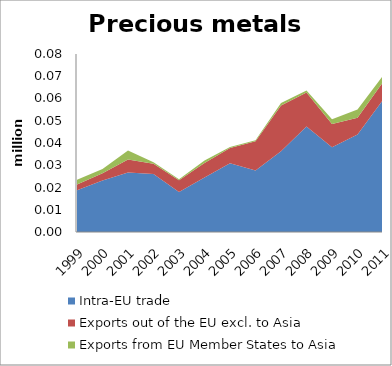
| Category | Intra-EU trade | Exports out of the EU excl. to Asia | Exports from EU Member States to Asia |
|---|---|---|---|
| 1999.0 | 0.019 | 0.003 | 0.002 |
| 2000.0 | 0.023 | 0.003 | 0.002 |
| 2001.0 | 0.027 | 0.006 | 0.004 |
| 2002.0 | 0.026 | 0.005 | 0.001 |
| 2003.0 | 0.018 | 0.005 | 0.001 |
| 2004.0 | 0.025 | 0.007 | 0.001 |
| 2005.0 | 0.031 | 0.007 | 0 |
| 2006.0 | 0.028 | 0.013 | 0 |
| 2007.0 | 0.036 | 0.021 | 0.001 |
| 2008.0 | 0.047 | 0.015 | 0.001 |
| 2009.0 | 0.038 | 0.01 | 0.002 |
| 2010.0 | 0.044 | 0.008 | 0.004 |
| 2011.0 | 0.059 | 0.008 | 0.003 |